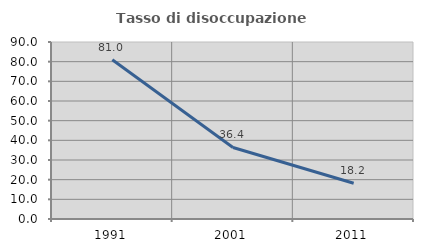
| Category | Tasso di disoccupazione giovanile  |
|---|---|
| 1991.0 | 80.952 |
| 2001.0 | 36.364 |
| 2011.0 | 18.182 |